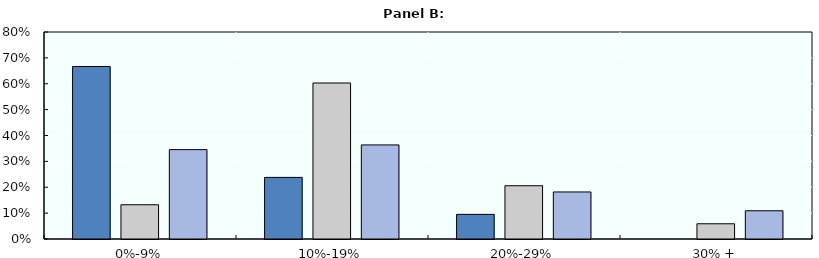
| Category | Investment Hubs | Low and middle income | High income |
|---|---|---|---|
| 0%-9% | 0.667 | 0.132 | 0.345 |
| 10%-19% | 0.238 | 0.603 | 0.364 |
| 20%-29% | 0.095 | 0.206 | 0.182 |
| 30% + | 0 | 0.059 | 0.109 |